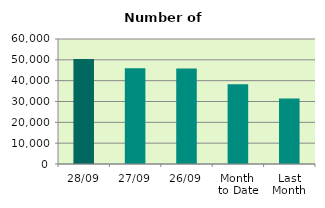
| Category | Series 0 |
|---|---|
| 28/09 | 50432 |
| 27/09 | 45952 |
| 26/09 | 45864 |
| Month 
to Date | 38278.8 |
| Last
Month | 31456 |